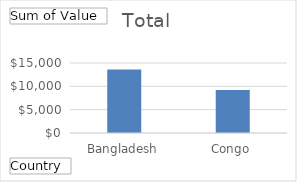
| Category | Total |
|---|---|
| Bangladesh | 13627.2 |
| Congo, The Democratic Republic | 9225.6 |